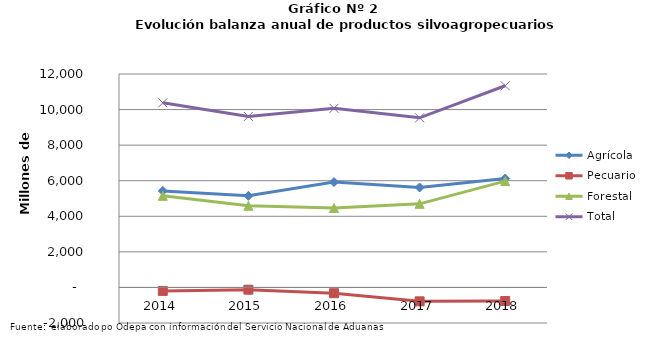
| Category | Agrícola | Pecuario | Forestal | Total |
|---|---|---|---|---|
| 2014.0 | 5424524 | -195643 | 5149868 | 10378749 |
| 2015.0 | 5149872 | -127785 | 4591408 | 9613495 |
| 2016.0 | 5924661 | -325380 | 4468104 | 10067385 |
| 2017.0 | 5619304 | -782588 | 4700192 | 9536908 |
| 2018.0 | 6124551 | -761791 | 5976134 | 11338894 |